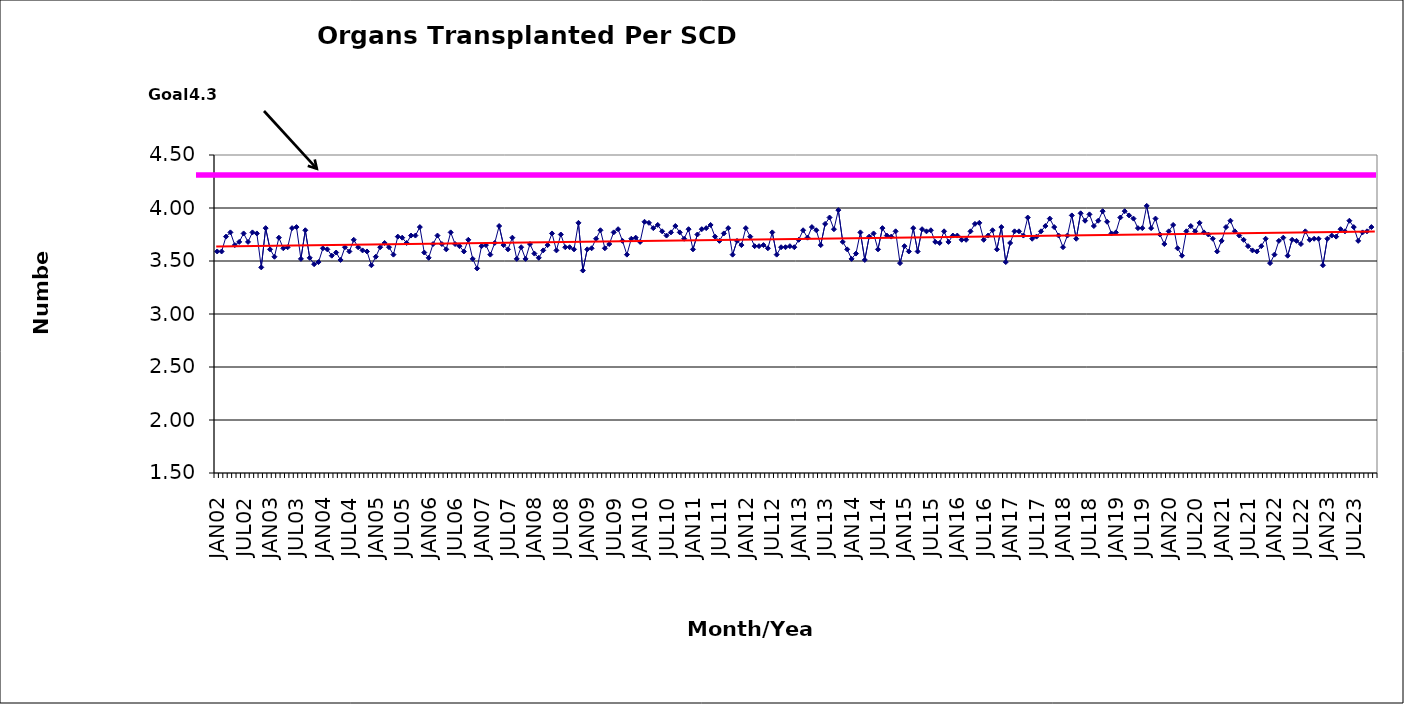
| Category | Series 0 |
|---|---|
| JAN02 | 3.59 |
| FEB02 | 3.59 |
| MAR02 | 3.73 |
| APR02 | 3.77 |
| MAY02 | 3.65 |
| JUN02 | 3.68 |
| JUL02 | 3.76 |
| AUG02 | 3.68 |
| SEP02 | 3.77 |
| OCT02 | 3.76 |
| NOV02 | 3.44 |
| DEC02 | 3.81 |
| JAN03 | 3.61 |
| FEB03 | 3.54 |
| MAR03 | 3.72 |
| APR03 | 3.62 |
| MAY03 | 3.63 |
| JUN03 | 3.81 |
| JUL03 | 3.82 |
| AUG03 | 3.52 |
| SEP03 | 3.79 |
| OCT03 | 3.53 |
| NOV03 | 3.47 |
| DEC03 | 3.49 |
| JAN04 | 3.62 |
| FEB04 | 3.61 |
| MAR04 | 3.55 |
| APR04 | 3.58 |
| MAY04 | 3.51 |
| JUN04 | 3.63 |
| JUL04 | 3.59 |
| AUG04 | 3.7 |
| SEP04 | 3.63 |
| OCT04 | 3.6 |
| NOV04 | 3.59 |
| DEC04 | 3.46 |
| JAN05 | 3.54 |
| FEB05 | 3.63 |
| MAR05 | 3.67 |
| APR05 | 3.63 |
| MAY05 | 3.56 |
| JUN05 | 3.73 |
| JUL05 | 3.72 |
| AUG05 | 3.67 |
| SEP05 | 3.74 |
| OCT05 | 3.74 |
| NOV05 | 3.82 |
| DEC05 | 3.58 |
| JAN06 | 3.53 |
| FEB06 | 3.66 |
| MAR06 | 3.74 |
| APR06 | 3.66 |
| MAY06 | 3.61 |
| JUN06 | 3.77 |
| JUL06 | 3.66 |
| AUG06 | 3.64 |
| SEP06 | 3.59 |
| OCT06 | 3.7 |
| NOV06 | 3.52 |
| DEC06 | 3.43 |
| JAN07 | 3.64 |
| FEB07 | 3.65 |
| MAR07 | 3.56 |
| APR07 | 3.67 |
| MAY07 | 3.83 |
| JUN07 | 3.65 |
| JUL07 | 3.61 |
| AUG07 | 3.72 |
| SEP07 | 3.52 |
| OCT07 | 3.63 |
| NOV07 | 3.52 |
| DEC07 | 3.66 |
| JAN08 | 3.57 |
| FEB08 | 3.53 |
| MAR08 | 3.6 |
| APR08 | 3.65 |
| MAY08 | 3.76 |
| JUN08 | 3.6 |
| JUL08 | 3.75 |
| AUG08 | 3.63 |
| SEP08 | 3.63 |
| OCT08 | 3.61 |
| NOV08 | 3.86 |
| DEC08 | 3.41 |
| JAN09 | 3.61 |
| FEB09 | 3.62 |
| MAR09 | 3.71 |
| APR09 | 3.79 |
| MAY09 | 3.62 |
| JUN09 | 3.66 |
| JUL09 | 3.77 |
| AUG09 | 3.8 |
| SEP09 | 3.69 |
| OCT09 | 3.56 |
| NOV09 | 3.71 |
| DEC09 | 3.72 |
| JAN10 | 3.68 |
| FEB10 | 3.87 |
| MAR10 | 3.86 |
| APR10 | 3.81 |
| MAY10 | 3.84 |
| JUN10 | 3.78 |
| JUL10 | 3.74 |
| AUG10 | 3.77 |
| SEP10 | 3.83 |
| OCT10 | 3.77 |
| NOV10 | 3.71 |
| DEC10 | 3.8 |
| JAN11 | 3.61 |
| FEB11 | 3.75 |
| MAR11 | 3.8 |
| APR11 | 3.81 |
| MAY11 | 3.84 |
| JUN11 | 3.73 |
| JUL11 | 3.69 |
| AUG11 | 3.76 |
| SEP11 | 3.81 |
| OCT11 | 3.56 |
| NOV11 | 3.69 |
| DEC11 | 3.65 |
| JAN12 | 3.81 |
| FEB12 | 3.73 |
| MAR12 | 3.64 |
| APR12 | 3.64 |
| MAY12 | 3.65 |
| JUN12 | 3.62 |
| JUL12 | 3.77 |
| AUG12 | 3.56 |
| SEP12 | 3.63 |
| OCT12 | 3.63 |
| NOV12 | 3.64 |
| DEC12 | 3.63 |
| JAN13 | 3.7 |
| FEB13 | 3.79 |
| MAR13 | 3.72 |
| APR13 | 3.82 |
| MAY13 | 3.79 |
| JUN13 | 3.65 |
| JUL13 | 3.85 |
| AUG13 | 3.91 |
| SEP13 | 3.8 |
| OCT13 | 3.98 |
| NOV13 | 3.68 |
| DEC13 | 3.61 |
| JAN14 | 3.52 |
| FEB14 | 3.57 |
| MAR14 | 3.77 |
| APR14 | 3.51 |
| MAY14 | 3.73 |
| JUN14 | 3.76 |
| JUL14 | 3.61 |
| AUG14 | 3.81 |
| SEP14 | 3.74 |
| OCT14 | 3.73 |
| NOV14 | 3.78 |
| DEC14 | 3.48 |
| JAN15 | 3.64 |
| FEB15 | 3.59 |
| MAR15 | 3.81 |
| APR15 | 3.59 |
| MAY15 | 3.8 |
| JUN15 | 3.78 |
| JUL15 | 3.79 |
| AUG15 | 3.68 |
| SEP15 | 3.67 |
| OCT15 | 3.78 |
| NOV15 | 3.68 |
| DEC15 | 3.74 |
| JAN16 | 3.74 |
| FEB16 | 3.7 |
| MAR16 | 3.7 |
| APR16 | 3.78 |
| MAY16 | 3.85 |
| JUN16 | 3.86 |
| JUL16 | 3.7 |
| AUG16 | 3.74 |
| SEP16 | 3.79 |
| OCT16 | 3.61 |
| NOV16 | 3.82 |
| DEC16 | 3.49 |
| JAN17 | 3.67 |
| FEB17 | 3.78 |
| MAR17 | 3.78 |
| APR17 | 3.74 |
| MAY17 | 3.91 |
| JUN17 | 3.71 |
| JUL17 | 3.73 |
| AUG17 | 3.78 |
| SEP17 | 3.83 |
| OCT17 | 3.9 |
| NOV17 | 3.82 |
| DEC17 | 3.74 |
| JAN18 | 3.63 |
| FEB18 | 3.74 |
| MAR18 | 3.93 |
| APR18 | 3.71 |
| MAY18 | 3.95 |
| JUN18 | 3.88 |
| JUL18 | 3.94 |
| AUG18 | 3.83 |
| SEP18 | 3.88 |
| OCT18 | 3.97 |
| NOV18 | 3.87 |
| DEC18 | 3.76 |
| JAN19 | 3.77 |
| FEB19 | 3.91 |
| MAR19 | 3.97 |
| APR19 | 3.93 |
| MAY19 | 3.9 |
| JUN19 | 3.81 |
| JUL19 | 3.81 |
| AUG19 | 4.02 |
| SEP19 | 3.81 |
| OCT19 | 3.9 |
| NOV19 | 3.75 |
| DEC19 | 3.66 |
| JAN20 | 3.78 |
| FEB20 | 3.84 |
| MAR20 | 3.62 |
| APR20 | 3.55 |
| MAY20 | 3.78 |
| JUN20 | 3.83 |
| JUL20 | 3.78 |
| AUG20 | 3.86 |
| SEP20 | 3.77 |
| OCT20 | 3.75 |
| NOV20 | 3.71 |
| DEC20 | 3.59 |
| JAN21 | 3.69 |
| FEB21 | 3.82 |
| MAR21 | 3.88 |
| APR21 | 3.78 |
| MAY21 | 3.74 |
| JUN21 | 3.7 |
| JUL21 | 3.64 |
| AUG21 | 3.6 |
| SEP21 | 3.59 |
| OCT21 | 3.64 |
| NOV21 | 3.71 |
| DEC21 | 3.48 |
| JAN22 | 3.56 |
| FEB22 | 3.69 |
| MAR22 | 3.72 |
| APR22 | 3.55 |
| MAY22 | 3.7 |
| JUN22 | 3.69 |
| JUL22 | 3.66 |
| AUG22 | 3.78 |
| SEP22 | 3.7 |
| OCT22 | 3.71 |
| NOV22 | 3.71 |
| DEC22 | 3.46 |
| JAN23 | 3.71 |
| FEB23 | 3.74 |
| MAR23 | 3.73 |
| APR23 | 3.8 |
| MAY23 | 3.78 |
| JUN23 | 3.88 |
| JUL23 | 3.82 |
| AUG23 | 3.69 |
| SEP23 | 3.77 |
| OCT23 | 3.78 |
| NOV23 | 3.82 |